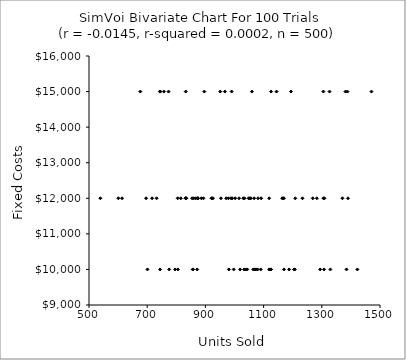
| Category | Series 0 |
|---|---|
| 854.2304992150957 | 12000 |
| 1169.8612101544886 | 12000 |
| 1371.0105038075726 | 12000 |
| 1079.3100416607313 | 10000 |
| 1282.8143712501453 | 12000 |
| 1059.6817778812351 | 15000 |
| 1124.5207805124694 | 10000 |
| 1422.243596117321 | 10000 |
| 805.4286285431208 | 10000 |
| 834.7279760569274 | 12000 |
| 1163.9249930490264 | 12000 |
| 953.4724346896035 | 12000 |
| 1002.3863059291955 | 12000 |
| 832.46673787131 | 15000 |
| 971.4091549471574 | 12000 |
| 676.3192585275103 | 15000 |
| 700.8362677956435 | 10000 |
| 992.2861438405348 | 12000 |
| 1208.8526924818707 | 12000 |
| 757.3443138062273 | 15000 |
| 1015.6611762761873 | 12000 |
| 1125.6151042472584 | 10000 |
| 1069.8917819320027 | 10000 |
| 832.4779355059433 | 12000 |
| 743.4577781368981 | 15000 |
| 926.0074625134736 | 12000 |
| 832.6524019448946 | 12000 |
| 1048.4379801212203 | 12000 |
| 1030.2035865437097 | 12000 |
| 1269.0459592912462 | 12000 |
| 1207.3383528489242 | 10000 |
| 1167.419868229228 | 12000 |
| 1307.7569829173165 | 10000 |
| 1125.902538398584 | 15000 |
| 1144.346987670863 | 15000 |
| 1038.9570459175025 | 10000 |
| 600.8797298106829 | 12000 |
| 874.603444996067 | 12000 |
| 804.8306583039259 | 12000 |
| 732.2427400086109 | 12000 |
| 990.2341857814116 | 15000 |
| 867.0982547768922 | 12000 |
| 1470.633751757023 | 15000 |
| 1233.5875804751317 | 12000 |
| 696.0218862822708 | 12000 |
| 922.4155705003785 | 12000 |
| 1294.5048946550708 | 10000 |
| 1119.1458730094935 | 12000 |
| 871.6810285204074 | 10000 |
| 538.9908018000363 | 12000 |
| 1090.0064026605994 | 10000 |
| 1381.4380059949115 | 15000 |
| 1034.4274075580267 | 12000 |
| 886.1509308388434 | 12000 |
| 951.0627538148608 | 15000 |
| 997.1800475709239 | 10000 |
| 613.5506962878214 | 12000 |
| 893.3244129630722 | 12000 |
| 979.2113113560837 | 12000 |
| 1187.6953989895499 | 10000 |
| 745.3334934036423 | 15000 |
| 1033.2367039437734 | 10000 |
| 966.9189485038161 | 15000 |
| 1204.8465738497155 | 10000 |
| 1308.8626778755079 | 12000 |
| 1388.136836670917 | 15000 |
| 831.9991147940208 | 12000 |
| 773.3525200595174 | 15000 |
| 1119.056043201873 | 10000 |
| 896.2870831988334 | 15000 |
| 980.6104859028452 | 10000 |
| 775.6312556755869 | 10000 |
| 744.2718811806145 | 10000 |
| 1329.3307403705946 | 10000 |
| 988.2144326386576 | 12000 |
| 1043.8988304091743 | 10000 |
| 815.30414517674 | 12000 |
| 1073.694357936928 | 10000 |
| 859.8738140657605 | 12000 |
| 1051.3923178232073 | 12000 |
| 1305.4874969343787 | 15000 |
| 856.3551125800636 | 10000 |
| 716.7415929467866 | 12000 |
| 1019.4637411597444 | 10000 |
| 1326.6852542907861 | 15000 |
| 1390.1126832711989 | 12000 |
| 921.2321974917412 | 12000 |
| 1091.6443304564064 | 12000 |
| 1080.9036500692785 | 12000 |
| 795.8772844647125 | 10000 |
| 1385.0025651443389 | 10000 |
| 1305.7105710319795 | 12000 |
| 857.5931844233969 | 10000 |
| 873.9411724435046 | 12000 |
| 1194.1909050114357 | 15000 |
| 1067.4961717098668 | 12000 |
| 1170.0797885633278 | 10000 |
| 873.6827009415773 | 12000 |
| 1056.208619638397 | 12000 |
| 1064.546339232998 | 10000 |